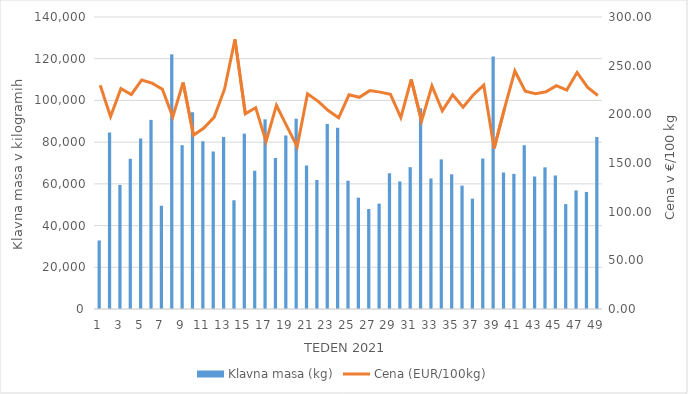
| Category | Klavna masa (kg) |
|---|---|
| 1.0 | 32871 |
| 2.0 | 84639 |
| 3.0 | 59476 |
| 4.0 | 72013 |
| 5.0 | 81759 |
| 6.0 | 90669 |
| 7.0 | 49517 |
| 8.0 | 122111 |
| 9.0 | 78545 |
| 10.0 | 94384 |
| 11.0 | 80405 |
| 12.0 | 75534 |
| 13.0 | 82440 |
| 14.0 | 52143 |
| 15.0 | 84105 |
| 16.0 | 66298 |
| 17.0 | 90925 |
| 18.0 | 72394 |
| 19.0 | 83193 |
| 20.0 | 91231 |
| 21.0 | 68763 |
| 22.0 | 61837 |
| 23.0 | 88747 |
| 24.0 | 86888 |
| 25.0 | 61507 |
| 26.0 | 53379 |
| 27.0 | 47910 |
| 28.0 | 50529 |
| 29.0 | 65062 |
| 30.0 | 61178 |
| 31.0 | 67992 |
| 32.0 | 96308 |
| 33.0 | 62558 |
| 34.0 | 71729 |
| 35.0 | 64596 |
| 36.0 | 59160 |
| 37.0 | 52905 |
| 38.0 | 72159 |
| 39.0 | 121060 |
| 40.0 | 65445 |
| 41.0 | 64780 |
| 42.0 | 78522 |
| 43.0 | 63486 |
| 44.0 | 67920 |
| 45.0 | 64023 |
| 46.0 | 50280 |
| 47.0 | 56852 |
| 48.0 | 56136 |
| 49.0 | 82462 |